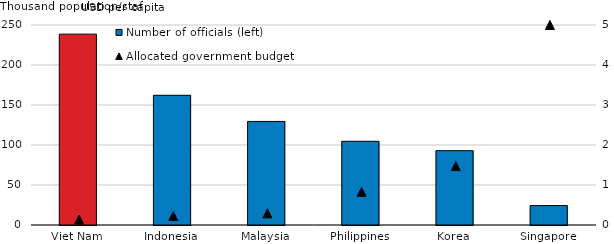
| Category | Number of officials (left) |
|---|---|
| Viet Nam | 238.575 |
| Indonesia | 162.126 |
| Malaysia | 129.464 |
| Philippines | 104.663 |
| Korea | 92.896 |
| Singapore | 24.298 |